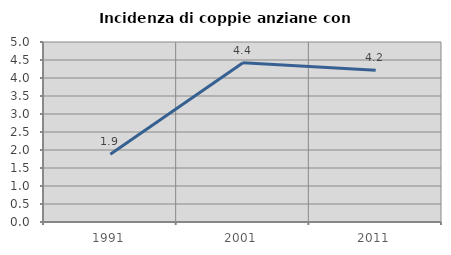
| Category | Incidenza di coppie anziane con figli |
|---|---|
| 1991.0 | 1.88 |
| 2001.0 | 4.426 |
| 2011.0 | 4.214 |